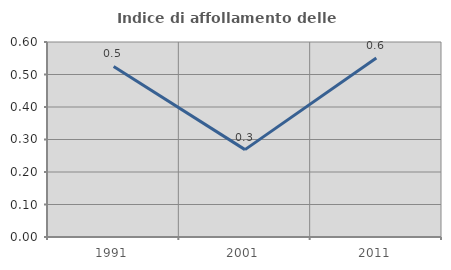
| Category | Indice di affollamento delle abitazioni  |
|---|---|
| 1991.0 | 0.525 |
| 2001.0 | 0.269 |
| 2011.0 | 0.551 |